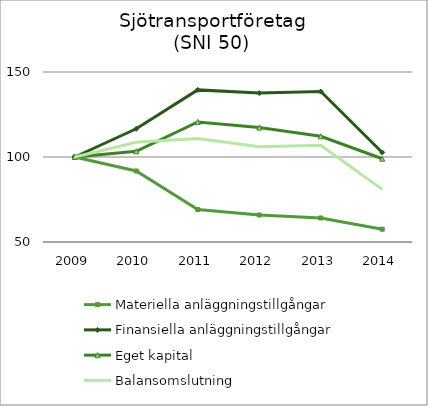
| Category | Materiella anläggningstillgångar | Finansiella anläggningstillgångar | Eget kapital | Balansomslutning |
|---|---|---|---|---|
| 2009.0 | 100 | 100 | 100 | 100 |
| 2010.0 | 91.748 | 116.594 | 103.354 | 108.657 |
| 2011.0 | 69.088 | 139.474 | 120.639 | 110.941 |
| 2012.0 | 65.889 | 137.635 | 117.299 | 106.092 |
| 2013.0 | 64.12 | 138.502 | 112.178 | 106.855 |
| 2014.0 | 57.524 | 102.66 | 98.991 | 80.942 |